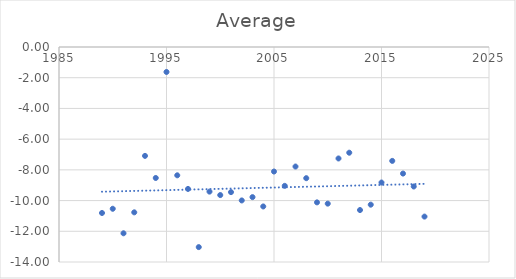
| Category | Average |
|---|---|
| 1989.0 | -10.808 |
| 1990.0 | -10.533 |
| 1991.0 | -12.13 |
| 1992.0 | -10.767 |
| 1993.0 | -7.09 |
| 1994.0 | -8.529 |
| 1995.0 | -1.625 |
| 1996.0 | -8.355 |
| 1997.0 | -9.242 |
| 1998.0 | -13.03 |
| 1999.0 | -9.417 |
| 2000.0 | -9.642 |
| 2001.0 | -9.45 |
| 2002.0 | -9.992 |
| 2003.0 | -9.775 |
| 2004.0 | -10.383 |
| 2005.0 | -8.108 |
| 2006.0 | -9.042 |
| 2007.0 | -7.783 |
| 2008.0 | -8.542 |
| 2009.0 | -10.117 |
| 2010.0 | -10.2 |
| 2011.0 | -7.258 |
| 2012.0 | -6.883 |
| 2013.0 | -10.617 |
| 2014.0 | -10.267 |
| 2015.0 | -8.825 |
| 2016.0 | -7.417 |
| 2017.0 | -8.242 |
| 2018.0 | -9.083 |
| 2019.0 | -11.043 |